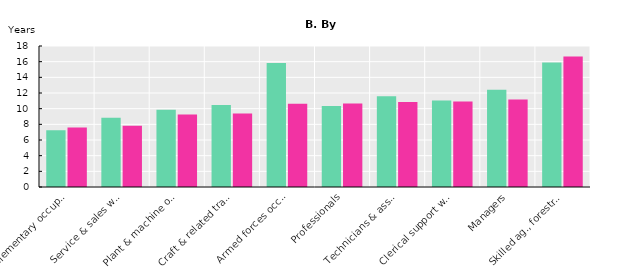
| Category | Men | Women |
|---|---|---|
| Elementary occupations | 7.258 | 7.597 |
| Service & sales workers | 8.848 | 7.824 |
| Plant & machine operators, & assemblers | 9.877 | 9.264 |
| Craft & related trades workers | 10.481 | 9.369 |
| Armed forces occupations | 15.841 | 10.614 |
| Professionals | 10.341 | 10.675 |
| Technicians & associate professionals | 11.595 | 10.844 |
| Clerical support workers | 11.037 | 10.919 |
| Managers | 12.416 | 11.156 |
| Skilled ag., forestry & fishery workers | 15.879 | 16.648 |